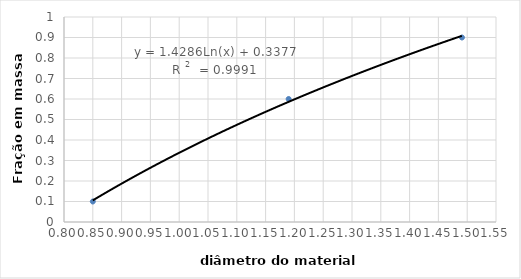
| Category | Fração |
|---|---|
| 0.85 | 0.1 |
| 1.19 | 0.6 |
| 1.4909145232369003 | 0.9 |